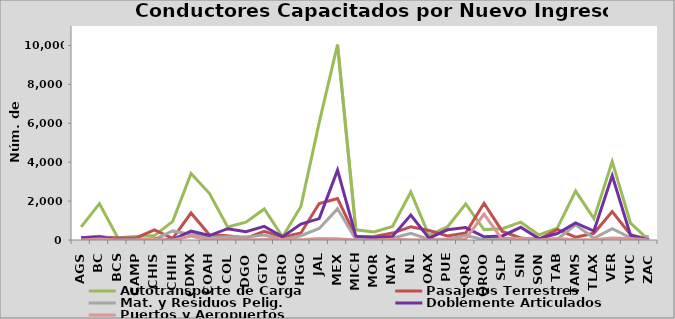
| Category | Autotransporte de Carga | Pasajeros Terrestres | Mat. y Residuos Pelig. | Doblemente Articulados | Puertos y Aeropuertos |
|---|---|---|---|---|---|
| AGS | 671 | 25 | 101 | 117 | 0 |
| BC | 1867 | 153 | 194 | 167 | 57 |
| BCS | 115 | 114 | 14 | 0 | 4 |
| CAMP | 186 | 108 | 24 | 0 | 12 |
| CHIS | 227 | 515 | 35 | 45 | 57 |
| CHIH | 958 | 85 | 466 | 24 | 0 |
| CDMX | 3422 | 1386 | 282 | 453 | 198 |
| COAH | 2399 | 270 | 132 | 229 | 0 |
| COL | 673 | 218 | 161 | 581 | 41 |
| DGO | 918 | 101 | 159 | 422 | 7 |
| GTO | 1597 | 451 | 260 | 699 | 29 |
| GRO | 168 | 145 | 20 | 170 | 21 |
| HGO | 1725 | 361 | 221 | 820 | 11 |
| JAL | 6046 | 1879 | 594 | 1099 | 80 |
| MEX | 10042 | 2131 | 1601 | 3591 | 66 |
| MICH | 525 | 163 | 27 | 199 | 0 |
| MOR | 411 | 185 | 38 | 116 | 2 |
| NAY | 696 | 357 | 89 | 184 | 39 |
| NL | 2464 | 682 | 338 | 1283 | 12 |
| OAX | 233 | 488 | 32 | 92 | 2 |
| PUE | 672 | 204 | 54 | 524 | 14 |
| QRO | 1857 | 359 | 233 | 639 | 55 |
| QROO | 534 | 1888 | 16 | 166 | 1328 |
| SLP | 579 | 441 | 81 | 207 | 15 |
| SIN | 916 | 104 | 93 | 652 | 29 |
| SON | 257 | 20 | 40 | 70 | 4 |
| TAB | 613 | 541 | 40 | 331 | 82 |
| TAMS | 2516 | 146 | 786 | 875 | 11 |
| TLAX | 1099 | 343 | 88 | 460 | 16 |
| VER | 4029 | 1464 | 581 | 3309 | 97 |
| YUC | 867 | 272 | 114 | 246 | 83 |
| ZAC | 0 | 0 | 174 | 0 | 0 |